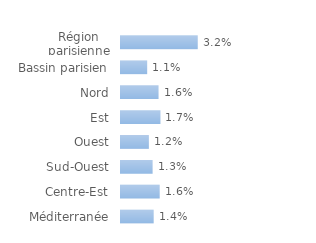
| Category | Series 0 |
|---|---|
| Région parisienne | 0.032 |
| Bassin parisien | 0.011 |
| Nord | 0.016 |
| Est | 0.017 |
| Ouest | 0.012 |
| Sud-Ouest | 0.013 |
| Centre-Est | 0.016 |
| Méditerranée | 0.014 |